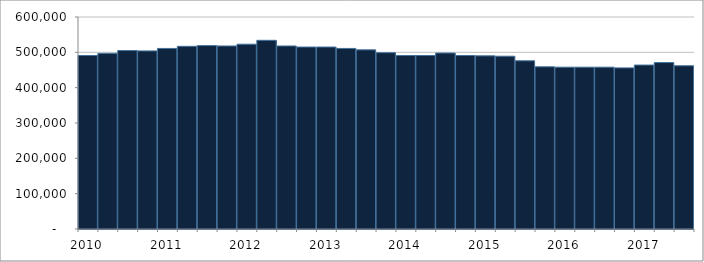
| Category | Series 0 |
|---|---|
| 2010.0 | 491000 |
| nan | 497000 |
| nan | 505000 |
| nan | 504000 |
| 2011.0 | 511000 |
| nan | 517000 |
| nan | 519000 |
| nan | 518000 |
| 2012.0 | 523000 |
| nan | 534000 |
| nan | 518000 |
| nan | 515000 |
| 2013.0 | 515000 |
| nan | 511000 |
| nan | 507000 |
| nan | 499000 |
| 2014.0 | 491000 |
| nan | 491000 |
| nan | 498000 |
| nan | 491000 |
| 2015.0 | 490000 |
| nan | 489000 |
| nan | 476000 |
| nan | 459000 |
| 2016.0 | 458000 |
| nan | 458000 |
| nan | 458000 |
| nan | 456000 |
| 2017.0 | 464000 |
| nan | 471000 |
| nan | 462000 |